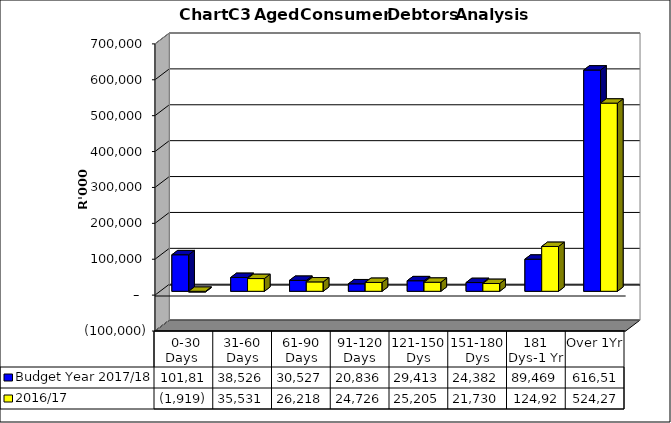
| Category | Budget Year 2017/18 | 2016/17 |
|---|---|---|
|  0-30 Days  | 101810787.64 | -1919002.08 |
| 31-60 Days | 38525728.63 | 35530788.54 |
| 61-90 Days | 30527280.23 | 26218409.23 |
| 91-120 Days | 20835620.5 | 24725969.22 |
| 121-150 Dys | 29413423.63 | 25205319.95 |
| 151-180 Dys | 24382497.62 | 21730167.6 |
| 181 Dys-1 Yr | 89469165.93 | 124922701.53 |
| Over 1Yr | 616514459.58 | 524272919.1 |